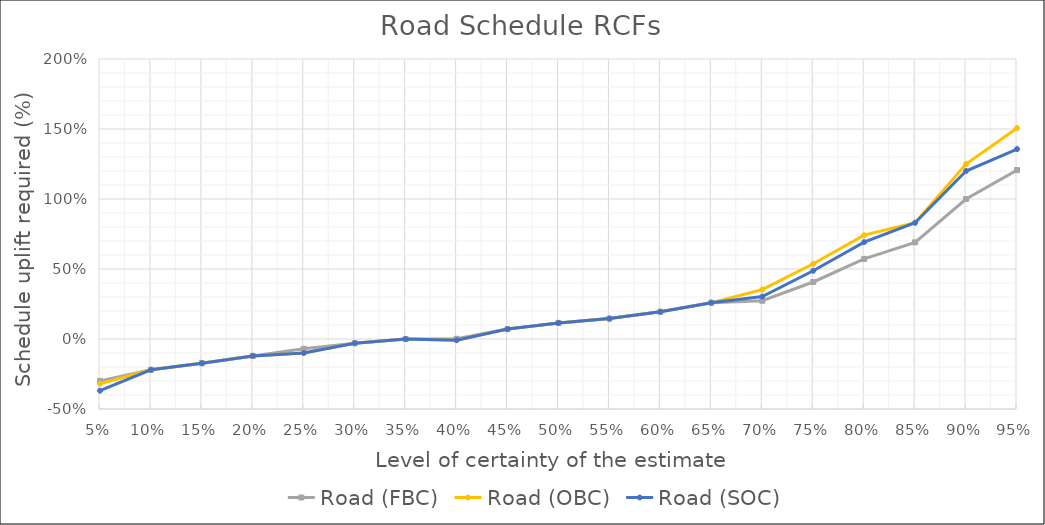
| Category | Road (FBC) | Road (OBC) | Road (SOC) |
|---|---|---|---|
| 0.05 | -0.299 | -0.319 | -0.369 |
| 0.1 | -0.22 | -0.22 | -0.22 |
| 0.15 | -0.173 | -0.173 | -0.173 |
| 0.2 | -0.121 | -0.121 | -0.121 |
| 0.25 | -0.07 | -0.1 | -0.1 |
| 0.3 | -0.03 | -0.03 | -0.03 |
| 0.35 | 0 | 0 | 0 |
| 0.4 | 0.001 | -0.009 | -0.009 |
| 0.45 | 0.071 | 0.071 | 0.071 |
| 0.5 | 0.115 | 0.115 | 0.115 |
| 0.55 | 0.146 | 0.146 | 0.146 |
| 0.6 | 0.194 | 0.194 | 0.194 |
| 0.65 | 0.259 | 0.259 | 0.259 |
| 0.7 | 0.273 | 0.353 | 0.303 |
| 0.75 | 0.407 | 0.537 | 0.487 |
| 0.8 | 0.572 | 0.742 | 0.692 |
| 0.85 | 0.69 | 0.83 | 0.83 |
| 0.9 | 1 | 1.25 | 1.2 |
| 0.95 | 1.207 | 1.507 | 1.357 |